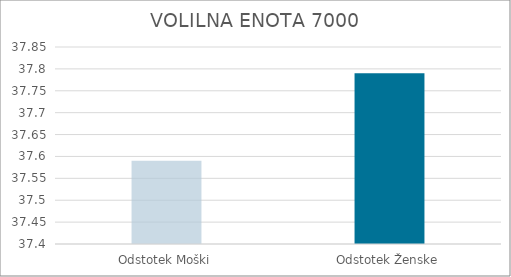
| Category | Series 0 |
|---|---|
| Odstotek Moški | 37.59 |
| Odstotek Ženske | 37.79 |